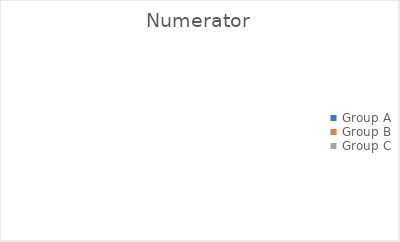
| Category | Numerator |
|---|---|
| Group A | 0 |
| Group B | 0 |
| Group C | 0 |